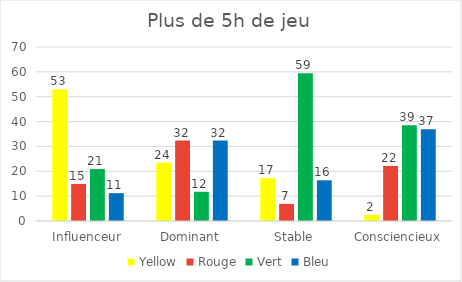
| Category | Yellow | Rouge | Vert | Bleu |
|---|---|---|---|---|
| Influenceur | 52.985 | 14.925 | 20.896 | 11.194 |
| Dominant | 23.529 | 32.353 | 11.765 | 32.353 |
| Stable | 17.241 | 6.897 | 59.483 | 16.379 |
| Consciencieux | 2.459 | 22.131 | 38.525 | 36.885 |